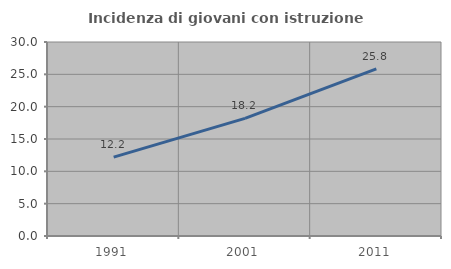
| Category | Incidenza di giovani con istruzione universitaria |
|---|---|
| 1991.0 | 12.195 |
| 2001.0 | 18.182 |
| 2011.0 | 25.843 |